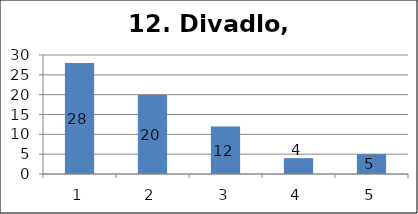
| Category | Series 1 |
|---|---|
| 0 | 28 |
| 1 | 20 |
| 2 | 12 |
| 3 | 4 |
| 4 | 5 |